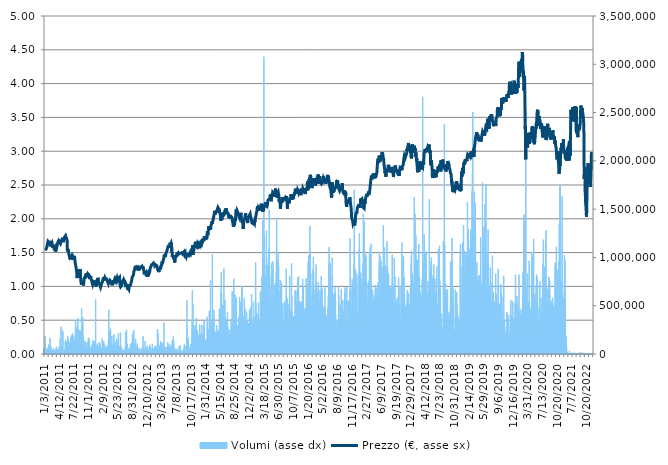
| Category | Volumi (asse dx) |
|---|---|
| 1/3/11 | 57810.176 |
| 1/4/11 | 41521.826 |
| 1/5/11 | 73502.117 |
| 1/6/11 | 15096.544 |
| 1/7/11 | 47100.125 |
| 1/10/11 | 59739.139 |
| 1/11/11 | 182088.08 |
| 1/12/11 | 23761.185 |
| 1/13/11 | 38979.239 |
| 1/14/11 | 40158.894 |
| 1/17/11 | 49718.655 |
| 1/18/11 | 23423.996 |
| 1/19/11 | 47818.044 |
| 1/20/11 | 35039.293 |
| 1/21/11 | 40614.555 |
| 1/24/11 | 27457.1 |
| 1/25/11 | 55677.684 |
| 1/26/11 | 12575.222 |
| 1/27/11 | 15343.614 |
| 1/28/11 | 47602.364 |
| 1/31/11 | 68024.063 |
| 2/1/11 | 47867.66 |
| 2/2/11 | 63451.255 |
| 2/3/11 | 51740.776 |
| 2/4/11 | 97541.761 |
| 2/7/11 | 72814.575 |
| 2/8/11 | 25965.57 |
| 2/9/11 | 42696.418 |
| 2/10/11 | 12645.09 |
| 2/11/11 | 57954.975 |
| 2/14/11 | 165105.101 |
| 2/15/11 | 17365.735 |
| 2/16/11 | 20222.221 |
| 2/17/11 | 29016.472 |
| 2/18/11 | 7947.735 |
| 2/21/11 | 74292.941 |
| 2/22/11 | 47494.018 |
| 2/23/11 | 23543.481 |
| 2/24/11 | 17756.59 |
| 2/25/11 | 28083.886 |
| 2/28/11 | 25432.954 |
| 3/1/11 | 26374.652 |
| 3/2/11 | 41559.291 |
| 3/3/11 | 34167.462 |
| 3/4/11 | 14073.839 |
| 3/7/11 | 21689.448 |
| 3/8/11 | 20088.56 |
| 3/9/11 | 29209.874 |
| 3/10/11 | 59475.869 |
| 3/11/11 | 11088.756 |
| 3/14/11 | 26539.703 |
| 3/15/11 | 34970.438 |
| 3/16/11 | 24125.714 |
| 3/17/11 | 14298.632 |
| 3/18/11 | 8283.911 |
| 3/21/11 | 33834.324 |
| 3/22/11 | 17667.483 |
| 3/23/11 | 5265.412 |
| 3/24/11 | 31788.914 |
| 3/25/11 | 19543.793 |
| 3/28/11 | 59484.982 |
| 3/29/11 | 74784.042 |
| 3/30/11 | 35554.696 |
| 3/31/11 | 32231.411 |
| 4/1/11 | 20441.95 |
| 4/4/11 | 37039.137 |
| 4/5/11 | 8369.98 |
| 4/6/11 | 3499.474 |
| 4/7/11 | 9266.113 |
| 4/8/11 | 46891.534 |
| 4/11/11 | 41811.423 |
| 4/12/11 | 22921.757 |
| 4/13/11 | 7091.093 |
| 4/14/11 | 26754.37 |
| 4/15/11 | 74399.262 |
| 4/18/11 | 33343.223 |
| 4/19/11 | 27151.301 |
| 4/20/11 | 40271.29 |
| 4/21/11 | 14298.632 |
| 4/26/11 | 152664.552 |
| 4/27/11 | 22356.738 |
| 4/28/11 | 50080.146 |
| 4/29/11 | 16146.589 |
| 5/2/11 | 282318.239 |
| 5/3/11 | 65652.602 |
| 5/4/11 | 76438.597 |
| 5/5/11 | 10684.736 |
| 5/6/11 | 47560.848 |
| 5/9/11 | 15454.997 |
| 5/10/11 | 90691.663 |
| 5/11/11 | 11564.668 |
| 5/12/11 | 244919.637 |
| 5/13/11 | 227125.581 |
| 5/16/11 | 25708.375 |
| 5/17/11 | 33398.915 |
| 5/18/11 | 23845.229 |
| 5/19/11 | 30040.189 |
| 5/20/11 | 17675.584 |
| 5/23/11 | 10580.441 |
| 5/24/11 | 44570.702 |
| 5/25/11 | 33851.538 |
| 5/26/11 | 20950.265 |
| 5/27/11 | 28601.314 |
| 5/30/11 | 33465.745 |
| 5/31/11 | 124794.32 |
| 6/1/11 | 146104.051 |
| 6/2/11 | 87123.333 |
| 6/3/11 | 36078.199 |
| 6/6/11 | 120464.531 |
| 6/7/11 | 120870.575 |
| 6/8/11 | 104821.194 |
| 6/9/11 | 83261.356 |
| 6/10/11 | 39356.931 |
| 6/13/11 | 134052.332 |
| 6/14/11 | 88942.938 |
| 6/15/11 | 113842.262 |
| 6/16/11 | 184251.962 |
| 6/17/11 | 151268.205 |
| 6/20/11 | 110017.751 |
| 6/21/11 | 134063.47 |
| 6/22/11 | 118226.731 |
| 6/23/11 | 68666.038 |
| 6/24/11 | 100804.292 |
| 6/27/11 | 121006.261 |
| 6/28/11 | 99007.976 |
| 6/29/11 | 92803.903 |
| 6/30/11 | 121770.758 |
| 7/1/11 | 82192.072 |
| 7/4/11 | 105704.163 |
| 7/5/11 | 81078.235 |
| 7/6/11 | 54056.544 |
| 7/7/11 | 173626.968 |
| 7/8/11 | 122372.23 |
| 7/11/11 | 97535.686 |
| 7/12/11 | 192859.899 |
| 7/13/11 | 145202.855 |
| 7/14/11 | 139645.82 |
| 7/15/11 | 158437.266 |
| 7/18/11 | 72252.594 |
| 7/19/11 | 213791.937 |
| 7/20/11 | 82748.991 |
| 7/21/11 | 175198.491 |
| 7/22/11 | 188015.719 |
| 7/25/11 | 13537.172 |
| 7/26/11 | 173471.031 |
| 7/27/11 | 162735.665 |
| 7/28/11 | 144195.339 |
| 7/29/11 | 106070.717 |
| 8/1/11 | 140707.003 |
| 8/2/11 | 97033.447 |
| 8/3/11 | 75157.684 |
| 8/4/11 | 75309.571 |
| 8/5/11 | 128556.052 |
| 8/8/11 | 232883.107 |
| 8/9/11 | 343612.701 |
| 8/10/11 | 287956.281 |
| 8/11/11 | 175743.259 |
| 8/12/11 | 70774.228 |
| 8/16/11 | 153397.659 |
| 8/17/11 | 146626.542 |
| 8/18/11 | 198374.405 |
| 8/19/11 | 270422.458 |
| 8/22/11 | 57300.848 |
| 8/23/11 | 80459.549 |
| 8/24/11 | 220735.193 |
| 8/25/11 | 372333.499 |
| 8/26/11 | 145840.78 |
| 8/29/11 | 124143.231 |
| 8/30/11 | 205616.372 |
| 8/31/11 | 182563.992 |
| 9/1/11 | 246460.782 |
| 9/2/11 | 78729.051 |
| 9/5/11 | 129746.845 |
| 9/6/11 | 249851.91 |
| 9/7/11 | 139357.235 |
| 9/8/11 | 186928.209 |
| 9/9/11 | 234225.787 |
| 9/12/11 | 211242.263 |
| 9/13/11 | 237912.588 |
| 9/14/11 | 87047.39 |
| 9/15/11 | 239808.136 |
| 9/16/11 | 144456.584 |
| 9/19/11 | 171045.903 |
| 9/20/11 | 469721.348 |
| 9/21/11 | 231239.691 |
| 9/22/11 | 206975.254 |
| 9/23/11 | 165161.805 |
| 9/26/11 | 283697.372 |
| 9/27/11 | 191180.03 |
| 9/28/11 | 379749.63 |
| 9/29/11 | 73630.714 |
| 9/30/11 | 173677.597 |
| 10/3/11 | 163399.917 |
| 10/4/11 | 140981.412 |
| 10/5/11 | 40321.919 |
| 10/6/11 | 59455.617 |
| 10/7/11 | 45138.759 |
| 10/10/11 | 57406.157 |
| 10/11/11 | 52628.808 |
| 10/12/11 | 81136.965 |
| 10/13/11 | 131710.236 |
| 10/14/11 | 90788.87 |
| 10/17/11 | 51648.631 |
| 10/18/11 | 67187.672 |
| 10/19/11 | 19317.987 |
| 10/20/11 | 58248.623 |
| 10/21/11 | 35618.488 |
| 10/24/11 | 57754.484 |
| 10/25/11 | 26599.445 |
| 10/26/11 | 116907.34 |
| 10/27/11 | 46144.25 |
| 10/28/11 | 55582.501 |
| 10/31/11 | 54383.608 |
| 11/1/11 | 124299.169 |
| 11/2/11 | 78134.667 |
| 11/3/11 | 121794.047 |
| 11/4/11 | 166739.404 |
| 11/7/11 | 58598.975 |
| 11/8/11 | 63213.299 |
| 11/9/11 | 161805.105 |
| 11/10/11 | 97568.088 |
| 11/11/11 | 141349.991 |
| 11/14/11 | 55867.036 |
| 11/15/11 | 9383.572 |
| 11/16/11 | 41327.41 |
| 11/17/11 | 26794.873 |
| 11/18/11 | 24238.11 |
| 11/21/11 | 46114.885 |
| 11/22/11 | 33223.739 |
| 11/23/11 | 66263.188 |
| 11/24/11 | 75870.54 |
| 11/25/11 | 55754.64 |
| 11/28/11 | 80532.455 |
| 11/29/11 | 50886.159 |
| 11/30/11 | 40100.164 |
| 12/1/11 | 101053.386 |
| 12/2/11 | 37056.351 |
| 12/5/11 | 97125.591 |
| 12/6/11 | 143183.772 |
| 12/7/11 | 21087.976 |
| 12/8/11 | 84060.281 |
| 12/9/11 | 90785.832 |
| 12/12/11 | 101059.462 |
| 12/13/11 | 74655.445 |
| 12/14/11 | 131726.438 |
| 12/15/11 | 119595.738 |
| 12/16/11 | 73361.368 |
| 12/19/11 | 83709.928 |
| 12/20/11 | 25208.161 |
| 12/21/11 | 77676.981 |
| 12/22/11 | 25248.664 |
| 12/23/11 | 568786.029 |
| 12/27/11 | 23658.915 |
| 12/28/11 | 34993.727 |
| 12/29/11 | 82946.444 |
| 12/30/11 | 42154.688 |
| 1/2/12 | 16270.124 |
| 1/3/12 | 22774.933 |
| 1/4/12 | 27691.005 |
| 1/5/12 | 107496.428 |
| 1/6/12 | 20130.076 |
| 1/9/12 | 41516.763 |
| 1/10/12 | 17711.024 |
| 1/11/12 | 12582.31 |
| 1/12/12 | 78458.692 |
| 1/13/12 | 49304.51 |
| 1/16/12 | 20879.385 |
| 1/17/12 | 18837.012 |
| 1/18/12 | 68737.931 |
| 1/19/12 | 121574.318 |
| 1/20/12 | 62850.795 |
| 1/23/12 | 114857.879 |
| 1/24/12 | 69948.976 |
| 1/25/12 | 95677.603 |
| 1/26/12 | 52611.594 |
| 1/27/12 | 24564.161 |
| 1/30/12 | 63908.941 |
| 1/31/12 | 29260.503 |
| 2/1/12 | 42514.153 |
| 2/2/12 | 32090.662 |
| 2/3/12 | 56366.238 |
| 2/6/12 | 58464.302 |
| 2/7/12 | 58306.34 |
| 2/8/12 | 161450.702 |
| 2/9/12 | 38378.78 |
| 2/10/12 | 71027.373 |
| 2/13/12 | 59169.057 |
| 2/14/12 | 36478.168 |
| 2/15/12 | 69005.252 |
| 2/16/12 | 100674.682 |
| 2/17/12 | 132044.387 |
| 2/20/12 | 111174.116 |
| 2/21/12 | 33132.606 |
| 2/22/12 | 91616.147 |
| 2/23/12 | 84486.577 |
| 2/24/12 | 63055.336 |
| 2/27/12 | 44946.369 |
| 2/28/12 | 11637.574 |
| 2/29/12 | 40154.844 |
| 3/1/12 | 30092.843 |
| 3/2/12 | 36318.181 |
| 3/5/12 | 70004.668 |
| 3/6/12 | 59068.812 |
| 3/7/12 | 32254.7 |
| 3/8/12 | 36944.967 |
| 3/9/12 | 86515.786 |
| 3/12/12 | 47652.993 |
| 3/13/12 | 57993.453 |
| 3/14/12 | 21627.681 |
| 3/15/12 | 63715.538 |
| 3/16/12 | 20907.737 |
| 3/19/12 | 34545.154 |
| 3/20/12 | 73555.783 |
| 3/21/12 | 138539.071 |
| 3/22/12 | 86671.723 |
| 3/23/12 | 455555.364 |
| 3/26/12 | 130332.116 |
| 3/27/12 | 128883.115 |
| 3/28/12 | 198316.688 |
| 3/29/12 | 94307.583 |
| 3/30/12 | 236920.26 |
| 4/2/12 | 210323.853 |
| 4/3/12 | 222305.704 |
| 4/4/12 | 261787.182 |
| 4/5/12 | 52214.663 |
| 4/10/12 | 80032.241 |
| 4/11/12 | 102097.355 |
| 4/12/12 | 74168.394 |
| 4/13/12 | 49037.189 |
| 4/16/12 | 85783.691 |
| 4/17/12 | 186174.85 |
| 4/18/12 | 92412.035 |
| 4/19/12 | 70033.02 |
| 4/20/12 | 45486.073 |
| 4/23/12 | 56310.546 |
| 4/24/12 | 95206.753 |
| 4/25/12 | 35415.973 |
| 4/26/12 | 56386.489 |
| 4/27/12 | 75487.785 |
| 4/30/12 | 58588.849 |
| 5/2/12 | 202105.76 |
| 5/3/12 | 101399.688 |
| 5/4/12 | 129526.103 |
| 5/7/12 | 28195.27 |
| 5/8/12 | 36200.722 |
| 5/9/12 | 47753.238 |
| 5/10/12 | 28596.251 |
| 5/11/12 | 29327.333 |
| 5/14/12 | 36981.42 |
| 5/15/12 | 32857.185 |
| 5/16/12 | 126063.082 |
| 5/17/12 | 79498.611 |
| 5/18/12 | 42377.455 |
| 5/21/12 | 158883.814 |
| 5/22/12 | 111251.072 |
| 5/23/12 | 47411.999 |
| 5/24/12 | 27874.282 |
| 5/25/12 | 43415.349 |
| 5/28/12 | 28715.736 |
| 5/29/12 | 116195.497 |
| 5/30/12 | 63169.758 |
| 5/31/12 | 148244.643 |
| 6/1/12 | 216327.436 |
| 6/4/12 | 43793.041 |
| 6/5/12 | 60948.159 |
| 6/6/12 | 51442.065 |
| 6/7/12 | 84871.357 |
| 6/8/12 | 46767.999 |
| 6/11/12 | 46884.445 |
| 6/12/12 | 36365.772 |
| 6/13/12 | 58158.503 |
| 6/14/12 | 30339.913 |
| 6/15/12 | 219553.513 |
| 6/18/12 | 66625.691 |
| 6/19/12 | 78044.547 |
| 6/20/12 | 34991.702 |
| 6/21/12 | 40014.095 |
| 6/22/12 | 70838.021 |
| 6/25/12 | 36591.577 |
| 6/26/12 | 45690.615 |
| 6/27/12 | 940.686 |
| 6/28/12 | 7319.936 |
| 6/29/12 | 40612.529 |
| 7/2/12 | 34461.11 |
| 7/3/12 | 13481.48 |
| 7/4/12 | 8306.188 |
| 7/5/12 | 22003.348 |
| 7/6/12 | 2957.744 |
| 7/9/12 | 41642.323 |
| 7/10/12 | 19657.201 |
| 7/11/12 | 3351.637 |
| 7/12/12 | 22097.517 |
| 7/13/12 | 53862.129 |
| 7/16/12 | 10270.592 |
| 7/17/12 | 15221.092 |
| 7/18/12 | 14213.575 |
| 7/19/12 | 227581.242 |
| 7/20/12 | 23753.085 |
| 7/23/12 | 65933.087 |
| 7/24/12 | 94220.501 |
| 7/25/12 | 88262.485 |
| 7/26/12 | 251402.169 |
| 7/27/12 | 14785.683 |
| 7/30/12 | 13016.707 |
| 7/31/12 | 32154.455 |
| 8/1/12 | 105543.163 |
| 8/2/12 | 38125.635 |
| 8/3/12 | 17297.892 |
| 8/6/12 | 27943.138 |
| 8/7/12 | 59580.164 |
| 8/8/12 | 30487.749 |
| 8/9/12 | 34843.865 |
| 8/10/12 | 34888.419 |
| 8/13/12 | 13566.537 |
| 8/14/12 | 37852.238 |
| 8/16/12 | 30583.944 |
| 8/17/12 | 54538.532 |
| 8/20/12 | 26316.935 |
| 8/21/12 | 24307.978 |
| 8/22/12 | 98847.989 |
| 8/23/12 | 18783.346 |
| 8/24/12 | 7004.011 |
| 8/27/12 | 61362.304 |
| 8/28/12 | 90060.826 |
| 8/29/12 | 98361.951 |
| 8/30/12 | 112626.155 |
| 8/31/12 | 119537.008 |
| 9/3/12 | 98064.252 |
| 9/4/12 | 20738.636 |
| 9/5/12 | 23991.041 |
| 9/6/12 | 212346.987 |
| 9/7/12 | 189974.048 |
| 9/10/12 | 127172.869 |
| 9/11/12 | 76939.823 |
| 9/12/12 | 132514.224 |
| 9/13/12 | 72000.462 |
| 9/14/12 | 247186.802 |
| 9/17/12 | 81323.279 |
| 9/18/12 | 97563.025 |
| 9/19/12 | 46346.766 |
| 9/20/12 | 25535.224 |
| 9/21/12 | 14697.588 |
| 9/24/12 | 30277.133 |
| 9/25/12 | 118784.662 |
| 9/26/12 | 91535.141 |
| 9/27/12 | 155738.742 |
| 9/28/12 | 89134.316 |
| 10/1/12 | 36821.433 |
| 10/2/12 | 46143.237 |
| 10/3/12 | 33127.543 |
| 10/4/12 | 65748.797 |
| 10/5/12 | 4094.871 |
| 10/8/12 | 32883.512 |
| 10/9/12 | 106503.088 |
| 10/10/12 | 78132.642 |
| 10/11/12 | 42322.776 |
| 10/12/12 | 46509.791 |
| 10/15/12 | 13032.908 |
| 10/16/12 | 16392.646 |
| 10/17/12 | 48057.012 |
| 10/18/12 | 50918.561 |
| 10/19/12 | 30220.428 |
| 10/22/12 | 18765.119 |
| 10/23/12 | 63164.695 |
| 10/24/12 | 56976.823 |
| 10/25/12 | 37323.672 |
| 10/26/12 | 18736.767 |
| 10/29/12 | 19997.428 |
| 10/30/12 | 15683.84 |
| 10/31/12 | 18195.037 |
| 11/1/12 | 13730.575 |
| 11/2/12 | 12728.121 |
| 11/5/12 | 31805.115 |
| 11/6/12 | 6635.432 |
| 11/7/12 | 51402.574 |
| 11/8/12 | 55070.136 |
| 11/9/12 | 25458.268 |
| 11/12/12 | 7173.112 |
| 11/13/12 | 22854.927 |
| 11/14/12 | 68439.22 |
| 11/15/12 | 37294.307 |
| 11/16/12 | 184167.918 |
| 11/19/12 | 18592.981 |
| 11/20/12 | 48540.013 |
| 11/21/12 | 33159.946 |
| 11/22/12 | 19020.289 |
| 11/23/12 | 29411.378 |
| 11/26/12 | 40880.863 |
| 11/27/12 | 34566.419 |
| 11/28/12 | 41690.926 |
| 11/29/12 | 35424.073 |
| 11/30/12 | 133297.961 |
| 12/3/12 | 17651.282 |
| 12/4/12 | 12863.807 |
| 12/5/12 | 25679.01 |
| 12/6/12 | 32850.097 |
| 12/7/12 | 12670.404 |
| 12/10/12 | 19830.352 |
| 12/11/12 | 67739.528 |
| 12/12/12 | 44751.954 |
| 12/13/12 | 37520.112 |
| 12/14/12 | 27964.402 |
| 12/17/12 | 83604.62 |
| 12/18/12 | 61696.455 |
| 12/19/12 | 35646.841 |
| 12/20/12 | 9011.956 |
| 12/21/12 | 27994.779 |
| 12/27/12 | 17000.193 |
| 12/28/12 | 28112.238 |
| 1/2/13 | 23608.286 |
| 1/3/13 | 12156.014 |
| 1/4/13 | 71556.952 |
| 1/7/13 | 46099.697 |
| 1/8/13 | 68899.944 |
| 1/9/13 | 71067.876 |
| 1/10/13 | 92718.846 |
| 1/11/13 | 31856.756 |
| 1/14/13 | 52713.864 |
| 1/15/13 | 26821.2 |
| 1/16/13 | 10219.963 |
| 1/17/13 | 8352.766 |
| 1/18/13 | 17094.363 |
| 1/21/13 | 24353.544 |
| 1/22/13 | 31451.725 |
| 1/23/13 | 30132.334 |
| 1/24/13 | 60129.995 |
| 1/25/13 | 104695.634 |
| 1/28/13 | 31987.379 |
| 1/29/13 | 29835.648 |
| 1/30/13 | 32892.625 |
| 1/31/13 | 56006.772 |
| 2/1/13 | 39111.887 |
| 2/4/13 | 20558.397 |
| 2/5/13 | 13957.393 |
| 2/6/13 | 20720.41 |
| 2/7/13 | 28916.226 |
| 2/8/13 | 20384.233 |
| 2/11/13 | 24193.557 |
| 2/12/13 | 81918.676 |
| 2/13/13 | 70697.272 |
| 2/14/13 | 48682.786 |
| 2/15/13 | 66298.628 |
| 2/18/13 | 82391.55 |
| 2/19/13 | 46663.703 |
| 2/20/13 | 69660.391 |
| 2/21/13 | 29106.591 |
| 2/22/13 | 39700.196 |
| 2/25/13 | 17185.495 |
| 2/26/13 | 37121.156 |
| 2/27/13 | 52347.311 |
| 2/28/13 | 91826.764 |
| 3/1/13 | 255566.908 |
| 3/4/13 | 96491.717 |
| 3/5/13 | 192114.64 |
| 3/6/13 | 210670.155 |
| 3/7/13 | 23247.808 |
| 3/8/13 | 18013.785 |
| 3/11/13 | 11798.574 |
| 3/12/13 | 12930.637 |
| 3/13/13 | 13785.254 |
| 3/14/13 | 24897.299 |
| 3/15/13 | 42247.845 |
| 3/18/13 | 87388.629 |
| 3/19/13 | 65969.54 |
| 3/20/13 | 33396.89 |
| 3/21/13 | 65968.527 |
| 3/22/13 | 108981.882 |
| 3/25/13 | 130042.518 |
| 3/26/13 | 115693.257 |
| 3/27/13 | 34858.041 |
| 3/28/13 | 39260.736 |
| 4/2/13 | 45871.866 |
| 4/3/13 | 99727.92 |
| 4/4/13 | 114518.665 |
| 4/5/13 | 33407.015 |
| 4/8/13 | 41274.756 |
| 4/9/13 | 44135.293 |
| 4/10/13 | 46298.162 |
| 4/11/13 | 32172.681 |
| 4/12/13 | 53695.054 |
| 4/15/13 | 9919.227 |
| 4/16/13 | 3169.373 |
| 4/17/13 | 326397.84 |
| 4/18/13 | 17087.275 |
| 4/19/13 | 50929.7 |
| 4/22/13 | 36226.036 |
| 4/23/13 | 44597.029 |
| 4/24/13 | 14962.884 |
| 4/25/13 | 73282.387 |
| 4/26/13 | 15809.4 |
| 4/29/13 | 10478.17 |
| 4/30/13 | 37821.861 |
| 5/2/13 | 69719.121 |
| 5/3/13 | 4539.393 |
| 5/6/13 | 11436.07 |
| 5/7/13 | 43754.563 |
| 5/8/13 | 34698.054 |
| 5/9/13 | 8126.961 |
| 5/10/13 | 42249.87 |
| 5/13/13 | 69591.536 |
| 5/14/13 | 56484.71 |
| 5/15/13 | 122115.035 |
| 5/16/13 | 78913.34 |
| 5/17/13 | 34697.041 |
| 5/20/13 | 53805.425 |
| 5/21/13 | 37744.905 |
| 5/22/13 | 62877.122 |
| 5/23/13 | 74895.426 |
| 5/24/13 | 57169.213 |
| 5/27/13 | 101040.223 |
| 5/28/13 | 78993.334 |
| 5/29/13 | 17911.515 |
| 5/30/13 | 40012.07 |
| 5/31/13 | 69500.404 |
| 6/3/13 | 82552.55 |
| 6/4/13 | 40012.07 |
| 6/5/13 | 5839.545 |
| 6/6/13 | 44943.331 |
| 6/7/13 | 81633.128 |
| 6/10/13 | 40691.511 |
| 6/11/13 | 30141.447 |
| 6/12/13 | 18636.522 |
| 6/13/13 | 135734.226 |
| 6/14/13 | 97843.51 |
| 6/17/13 | 66478.867 |
| 6/18/13 | 92859.595 |
| 6/19/13 | 24813.255 |
| 6/20/13 | 152911.621 |
| 6/21/13 | 179340.953 |
| 6/24/13 | 52050.625 |
| 6/25/13 | 129244.606 |
| 6/26/13 | 56521.162 |
| 6/27/13 | 49049.34 |
| 6/28/13 | 20672.818 |
| 7/1/13 | 20792.303 |
| 7/2/13 | 15111.733 |
| 7/3/13 | 54269.186 |
| 7/4/13 | 21854.498 |
| 7/5/13 | 19015.226 |
| 7/8/13 | 30088.793 |
| 7/9/13 | 5855.746 |
| 7/10/13 | 5855.746 |
| 7/11/13 | 25902.79 |
| 7/12/13 | 15917.746 |
| 7/15/13 | 37417.842 |
| 7/16/13 | 19930.598 |
| 7/17/13 | 54561.822 |
| 7/18/13 | 38706.855 |
| 7/19/13 | 34903.608 |
| 7/22/13 | 15283.872 |
| 7/23/13 | 26493.124 |
| 7/24/13 | 20711.296 |
| 7/25/13 | 4529.267 |
| 7/26/13 | 4865.443 |
| 7/29/13 | 4865.443 |
| 7/30/13 | 23689.292 |
| 7/31/13 | 83927.633 |
| 8/1/13 | 52927.519 |
| 8/2/13 | 28557.773 |
| 8/5/13 | 37864.389 |
| 8/6/13 | 21925.379 |
| 8/7/13 | 88104.522 |
| 8/8/13 | 34042.915 |
| 8/9/13 | 21642.869 |
| 8/12/13 | 16202.281 |
| 8/13/13 | 30004.749 |
| 8/14/13 | 28677.258 |
| 8/16/13 | 24761.614 |
| 8/19/13 | 9706.585 |
| 8/20/13 | 13568.562 |
| 8/21/13 | 13671.845 |
| 8/22/13 | 24746.425 |
| 8/23/13 | 1916.813 |
| 8/26/13 | 14047.512 |
| 8/27/13 | 20237.409 |
| 8/28/13 | 32068.386 |
| 8/29/13 | 50720.096 |
| 8/30/13 | 39207.069 |
| 9/2/13 | 11216.341 |
| 9/3/13 | 24433.538 |
| 9/4/13 | 8369.98 |
| 9/6/13 | 98808.498 |
| 9/9/13 | 29962.221 |
| 9/10/13 | 49468.548 |
| 9/11/13 | 87077.767 |
| 9/12/13 | 24837.557 |
| 9/13/13 | 20718.384 |
| 9/16/13 | 22021.574 |
| 9/17/13 | 73266.186 |
| 9/18/13 | 21239.863 |
| 9/19/13 | 80728.895 |
| 9/20/13 | 18049.226 |
| 9/23/13 | 29886.277 |
| 9/24/13 | 123188.369 |
| 9/25/13 | 556233.084 |
| 9/26/13 | 258331.249 |
| 9/27/13 | 198440.223 |
| 9/30/13 | 77173.729 |
| 10/1/13 | 18736.767 |
| 10/2/13 | 21532.498 |
| 10/3/13 | 48000.308 |
| 10/4/13 | 161788.904 |
| 10/7/13 | 41674.725 |
| 10/8/13 | 24141.915 |
| 10/9/13 | 66089.024 |
| 10/10/13 | 56613.307 |
| 10/11/13 | 49197.177 |
| 10/14/13 | 47336.056 |
| 10/15/13 | 40469.756 |
| 10/16/13 | 70266.926 |
| 10/17/13 | 59857.611 |
| 10/18/13 | 57379.83 |
| 10/21/13 | 95056.892 |
| 10/22/13 | 95010.313 |
| 10/23/13 | 33078.94 |
| 10/24/13 | 108493.819 |
| 10/25/13 | 62456.902 |
| 10/28/13 | 172282 |
| 10/29/13 | 118730 |
| 10/30/13 | 355929 |
| 10/31/13 | 660242 |
| 11/1/13 | 182930 |
| 11/4/13 | 147508 |
| 11/5/13 | 515184 |
| 11/6/13 | 155033 |
| 11/7/13 | 205618 |
| 11/8/13 | 87253 |
| 11/11/13 | 81127 |
| 11/12/13 | 293929 |
| 11/13/13 | 109362 |
| 11/14/13 | 131128 |
| 11/15/13 | 258490 |
| 11/18/13 | 60639 |
| 11/19/13 | 121122 |
| 11/20/13 | 18398 |
| 11/21/13 | 292013 |
| 11/22/13 | 227954 |
| 11/25/13 | 30002 |
| 11/26/13 | 18817 |
| 11/27/13 | 371686 |
| 11/28/13 | 208540 |
| 11/29/13 | 28039 |
| 12/2/13 | 43349 |
| 12/3/13 | 90168 |
| 12/4/13 | 247769 |
| 12/5/13 | 235844 |
| 12/6/13 | 55570 |
| 12/9/13 | 66388 |
| 12/10/13 | 56080 |
| 12/11/13 | 53449 |
| 12/12/13 | 17458 |
| 12/13/13 | 137747 |
| 12/16/13 | 186070 |
| 12/17/13 | 205598 |
| 12/18/13 | 106411 |
| 12/19/13 | 150755 |
| 12/20/13 | 303405 |
| 12/23/13 | 149468 |
| 12/27/13 | 64605 |
| 12/30/13 | 203718 |
| 1/2/14 | 143813 |
| 1/3/14 | 181278 |
| 1/6/14 | 53127 |
| 1/7/14 | 112172 |
| 1/8/14 | 146000 |
| 1/9/14 | 144802 |
| 1/10/14 | 299932 |
| 1/13/14 | 80159 |
| 1/14/14 | 46130 |
| 1/15/14 | 55139 |
| 1/16/14 | 200453 |
| 1/17/14 | 63411 |
| 1/20/14 | 106769 |
| 1/21/14 | 152896 |
| 1/22/14 | 87702 |
| 1/23/14 | 242672 |
| 1/24/14 | 291576 |
| 1/27/14 | 341744 |
| 1/28/14 | 49290 |
| 1/29/14 | 75409 |
| 1/30/14 | 98187 |
| 1/31/14 | 44833 |
| 2/3/14 | 106421 |
| 2/4/14 | 104136 |
| 2/5/14 | 148834 |
| 2/6/14 | 82960 |
| 2/7/14 | 143314 |
| 2/10/14 | 111315 |
| 2/11/14 | 20637 |
| 2/12/14 | 127386 |
| 2/13/14 | 39737 |
| 2/14/14 | 143131 |
| 2/17/14 | 384354 |
| 2/18/14 | 282611 |
| 2/19/14 | 95627 |
| 2/20/14 | 109663 |
| 2/21/14 | 221309 |
| 2/24/14 | 117745 |
| 2/25/14 | 52042 |
| 2/26/14 | 109193 |
| 2/27/14 | 255109 |
| 2/28/14 | 121743 |
| 3/3/14 | 445541 |
| 3/4/14 | 78211 |
| 3/5/14 | 267858 |
| 3/6/14 | 176545 |
| 3/7/14 | 229162 |
| 3/10/14 | 108201 |
| 3/11/14 | 761188 |
| 3/12/14 | 151088 |
| 3/13/14 | 287019 |
| 3/14/14 | 105889 |
| 3/17/14 | 89445 |
| 3/18/14 | 152571 |
| 3/19/14 | 262570 |
| 3/20/14 | 285797 |
| 3/21/14 | 336331 |
| 3/24/14 | 1034074 |
| 3/25/14 | 348379 |
| 3/26/14 | 386215 |
| 3/27/14 | 244730 |
| 3/28/14 | 361444 |
| 3/31/14 | 211072 |
| 4/1/14 | 363692 |
| 4/2/14 | 130568 |
| 4/3/14 | 455498 |
| 4/4/14 | 212464 |
| 4/7/14 | 150705 |
| 4/8/14 | 248203 |
| 4/9/14 | 89018 |
| 4/10/14 | 179270 |
| 4/11/14 | 62495 |
| 4/14/14 | 154777 |
| 4/15/14 | 224772 |
| 4/16/14 | 72518 |
| 4/17/14 | 196293 |
| 4/22/14 | 105991 |
| 4/23/14 | 198700 |
| 4/24/14 | 297377 |
| 4/25/14 | 139697 |
| 4/28/14 | 96017 |
| 4/29/14 | 239701 |
| 4/30/14 | 181775 |
| 5/2/14 | 211922 |
| 5/5/14 | 129556 |
| 5/6/14 | 63719 |
| 5/7/14 | 157971 |
| 5/8/14 | 107667 |
| 5/9/14 | 242798 |
| 5/12/14 | 141290 |
| 5/13/14 | 153298 |
| 5/14/14 | 468376 |
| 5/15/14 | 188696 |
| 5/16/14 | 406640 |
| 5/19/14 | 444968 |
| 5/20/14 | 376274 |
| 5/21/14 | 209306 |
| 5/22/14 | 87942 |
| 5/23/14 | 89435 |
| 5/26/14 | 632897 |
| 5/27/14 | 847923 |
| 5/28/14 | 362676 |
| 5/29/14 | 629563 |
| 5/30/14 | 175072 |
| 6/2/14 | 169456 |
| 6/3/14 | 259312 |
| 6/4/14 | 508436 |
| 6/5/14 | 146192 |
| 6/6/14 | 354158 |
| 6/9/14 | 64469 |
| 6/10/14 | 247834 |
| 6/11/14 | 218354 |
| 6/12/14 | 157116 |
| 6/13/14 | 883713 |
| 6/16/14 | 280941 |
| 6/17/14 | 180329 |
| 6/18/14 | 210398 |
| 6/19/14 | 182182 |
| 6/20/14 | 561537 |
| 6/23/14 | 59638 |
| 6/24/14 | 371837 |
| 6/25/14 | 255086 |
| 6/26/14 | 156256 |
| 6/27/14 | 108406 |
| 6/30/14 | 101573 |
| 7/1/14 | 266288 |
| 7/2/14 | 252043 |
| 7/3/14 | 335015 |
| 7/4/14 | 122351 |
| 7/7/14 | 35862 |
| 7/8/14 | 434736 |
| 7/9/14 | 176263 |
| 7/10/14 | 284211 |
| 7/11/14 | 244006 |
| 7/14/14 | 114800 |
| 7/15/14 | 93926 |
| 7/16/14 | 157982 |
| 7/17/14 | 207506 |
| 7/18/14 | 150269 |
| 7/21/14 | 155987 |
| 7/22/14 | 107774 |
| 7/23/14 | 143093 |
| 7/24/14 | 250738 |
| 7/25/14 | 144591 |
| 7/28/14 | 46761 |
| 7/29/14 | 198434 |
| 7/30/14 | 60462 |
| 7/31/14 | 158058 |
| 8/1/14 | 362715 |
| 8/4/14 | 287202 |
| 8/5/14 | 221398 |
| 8/6/14 | 293385 |
| 8/7/14 | 272407 |
| 8/8/14 | 647359 |
| 8/11/14 | 143750 |
| 8/12/14 | 152524 |
| 8/13/14 | 117204 |
| 8/14/14 | 182897 |
| 8/18/14 | 221017 |
| 8/19/14 | 214493 |
| 8/20/14 | 371511 |
| 8/21/14 | 778327 |
| 8/22/14 | 422619 |
| 8/25/14 | 328496 |
| 8/26/14 | 320737 |
| 8/27/14 | 410903 |
| 8/28/14 | 365991 |
| 8/29/14 | 612731 |
| 9/1/14 | 182001 |
| 9/2/14 | 249011 |
| 9/3/14 | 458806 |
| 9/4/14 | 294265 |
| 9/5/14 | 581653 |
| 9/8/14 | 581534 |
| 9/9/14 | 206171 |
| 9/10/14 | 145981 |
| 9/11/14 | 187291 |
| 9/12/14 | 104830 |
| 9/15/14 | 108117 |
| 9/16/14 | 293756 |
| 9/17/14 | 85812 |
| 9/18/14 | 226099 |
| 9/19/14 | 144947 |
| 9/22/14 | 56448 |
| 9/23/14 | 383243 |
| 9/24/14 | 134310 |
| 9/25/14 | 316122 |
| 9/26/14 | 150106 |
| 9/29/14 | 121655 |
| 9/30/14 | 589966 |
| 10/1/14 | 547737 |
| 10/2/14 | 376489 |
| 10/3/14 | 120631 |
| 10/6/14 | 253753 |
| 10/7/14 | 464267 |
| 10/8/14 | 530657 |
| 10/9/14 | 516809 |
| 10/10/14 | 504064 |
| 10/13/14 | 469124 |
| 10/14/14 | 454859 |
| 10/15/14 | 674116 |
| 10/16/14 | 699689 |
| 10/17/14 | 416948 |
| 10/20/14 | 302022 |
| 10/21/14 | 350427 |
| 10/22/14 | 301958 |
| 10/23/14 | 217696 |
| 10/24/14 | 392159 |
| 10/27/14 | 194851 |
| 10/28/14 | 199921 |
| 10/29/14 | 123656 |
| 10/30/14 | 321917 |
| 10/31/14 | 577676 |
| 11/3/14 | 273656 |
| 11/4/14 | 346740 |
| 11/5/14 | 473535 |
| 11/6/14 | 167598 |
| 11/7/14 | 211614 |
| 11/10/14 | 332761 |
| 11/11/14 | 181136 |
| 11/12/14 | 229214 |
| 11/13/14 | 177843 |
| 11/14/14 | 441695 |
| 11/17/14 | 432668 |
| 11/18/14 | 239593 |
| 11/19/14 | 337135 |
| 11/20/14 | 135782 |
| 11/21/14 | 122809 |
| 11/24/14 | 267733 |
| 11/25/14 | 306399 |
| 11/26/14 | 223511 |
| 11/27/14 | 208974 |
| 11/28/14 | 174038 |
| 12/1/14 | 154130 |
| 12/2/14 | 317686 |
| 12/3/14 | 314288 |
| 12/4/14 | 267244 |
| 12/5/14 | 456893 |
| 12/8/14 | 134059 |
| 12/9/14 | 333656 |
| 12/10/14 | 300934 |
| 12/11/14 | 117875 |
| 12/12/14 | 247558 |
| 12/15/14 | 482889 |
| 12/16/14 | 449240 |
| 12/17/14 | 388413 |
| 12/18/14 | 225880 |
| 12/19/14 | 616937 |
| 12/22/14 | 196879 |
| 12/23/14 | 355525 |
| 12/29/14 | 108695 |
| 12/30/14 | 113568 |
| 1/2/15 | 87963 |
| 1/5/15 | 225571 |
| 1/6/15 | 281290 |
| 1/7/15 | 201243 |
| 1/8/15 | 537746 |
| 1/9/15 | 312971 |
| 1/12/15 | 189527 |
| 1/13/15 | 201993 |
| 1/14/15 | 384229 |
| 1/15/15 | 350209 |
| 1/16/15 | 213593 |
| 1/19/15 | 107875 |
| 1/20/15 | 385300 |
| 1/21/15 | 378147 |
| 1/22/15 | 557408 |
| 1/23/15 | 946355 |
| 1/26/15 | 522463 |
| 1/27/15 | 341407 |
| 1/28/15 | 430088 |
| 1/29/15 | 258603 |
| 1/30/15 | 285225 |
| 2/2/15 | 299776 |
| 2/3/15 | 355433 |
| 2/4/15 | 386836 |
| 2/5/15 | 383215 |
| 2/6/15 | 410513 |
| 2/9/15 | 205828 |
| 2/10/15 | 372654 |
| 2/11/15 | 401466 |
| 2/12/15 | 532547 |
| 2/13/15 | 279984 |
| 2/16/15 | 157775 |
| 2/17/15 | 138804 |
| 2/18/15 | 149230 |
| 2/19/15 | 263021 |
| 2/20/15 | 113928 |
| 2/23/15 | 364938 |
| 2/24/15 | 309706 |
| 2/25/15 | 646803 |
| 2/26/15 | 251374 |
| 2/27/15 | 131304 |
| 3/2/15 | 287322 |
| 3/3/15 | 488452 |
| 3/4/15 | 386424 |
| 3/5/15 | 523835 |
| 3/6/15 | 798846 |
| 3/9/15 | 488464 |
| 3/10/15 | 607413 |
| 3/11/15 | 499528 |
| 3/12/15 | 1379436 |
| 3/13/15 | 992257 |
| 3/16/15 | 712790 |
| 3/17/15 | 710079 |
| 3/18/15 | 776944 |
| 3/19/15 | 608669 |
| 3/20/15 | 3077585 |
| 3/23/15 | 387347 |
| 3/24/15 | 1231424 |
| 3/25/15 | 579778 |
| 3/26/15 | 929077 |
| 3/27/15 | 801533 |
| 3/30/15 | 742942 |
| 3/31/15 | 570431 |
| 4/1/15 | 732249 |
| 4/2/15 | 810963 |
| 4/7/15 | 774056 |
| 4/8/15 | 778747 |
| 4/9/15 | 1279432 |
| 4/10/15 | 999791 |
| 4/13/15 | 302721 |
| 4/14/15 | 763374 |
| 4/15/15 | 731727 |
| 4/16/15 | 430397 |
| 4/17/15 | 919517 |
| 4/20/15 | 489137 |
| 4/21/15 | 554981 |
| 4/22/15 | 400876 |
| 4/23/15 | 892698 |
| 4/24/15 | 683035 |
| 4/27/15 | 1086393 |
| 4/28/15 | 820835 |
| 4/29/15 | 1491872 |
| 4/30/15 | 908321 |
| 5/4/15 | 444346 |
| 5/5/15 | 697223 |
| 5/6/15 | 336929 |
| 5/7/15 | 535142 |
| 5/8/15 | 370590 |
| 5/11/15 | 252494 |
| 5/12/15 | 396939 |
| 5/13/15 | 317580 |
| 5/14/15 | 814267 |
| 5/15/15 | 943077 |
| 5/18/15 | 419178 |
| 5/19/15 | 411912 |
| 5/20/15 | 772842 |
| 5/21/15 | 498795 |
| 5/22/15 | 865233 |
| 5/25/15 | 359747 |
| 5/26/15 | 957349 |
| 5/27/15 | 455027 |
| 5/28/15 | 362426 |
| 5/29/15 | 562576 |
| 6/1/15 | 602991 |
| 6/2/15 | 487528 |
| 6/3/15 | 503144 |
| 6/4/15 | 351707 |
| 6/5/15 | 637950 |
| 6/8/15 | 683049 |
| 6/9/15 | 730200 |
| 6/10/15 | 318596 |
| 6/11/15 | 376214 |
| 6/12/15 | 535662 |
| 6/15/15 | 642396 |
| 6/16/15 | 584411 |
| 6/17/15 | 855268 |
| 6/18/15 | 1090163 |
| 6/19/15 | 1407203 |
| 6/22/15 | 832211 |
| 6/23/15 | 974541 |
| 6/24/15 | 618857 |
| 6/25/15 | 779566 |
| 6/26/15 | 933282 |
| 6/29/15 | 877769 |
| 6/30/15 | 693627 |
| 7/1/15 | 1042192 |
| 7/2/15 | 912820 |
| 7/3/15 | 457310 |
| 7/6/15 | 431450 |
| 7/7/15 | 468567 |
| 7/8/15 | 515386 |
| 7/9/15 | 333894 |
| 7/10/15 | 497957 |
| 7/13/15 | 658796 |
| 7/14/15 | 766959 |
| 7/15/15 | 526705 |
| 7/16/15 | 358621 |
| 7/17/15 | 412696 |
| 7/20/15 | 316170 |
| 7/21/15 | 741357 |
| 7/22/15 | 411110 |
| 7/23/15 | 720515 |
| 7/24/15 | 263325 |
| 7/27/15 | 257722 |
| 7/28/15 | 113783 |
| 7/29/15 | 236539 |
| 7/30/15 | 169094 |
| 7/31/15 | 522664 |
| 8/3/15 | 197375 |
| 8/4/15 | 179585 |
| 8/5/15 | 347398 |
| 8/6/15 | 186602 |
| 8/7/15 | 226189 |
| 8/10/15 | 179569 |
| 8/11/15 | 228645 |
| 8/12/15 | 543599 |
| 8/13/15 | 344952 |
| 8/14/15 | 240177 |
| 8/17/15 | 408676 |
| 8/18/15 | 483358 |
| 8/19/15 | 261094 |
| 8/20/15 | 206528 |
| 8/21/15 | 527384 |
| 8/24/15 | 881556 |
| 8/25/15 | 593801 |
| 8/26/15 | 386624 |
| 8/27/15 | 494734 |
| 8/28/15 | 268640 |
| 8/31/15 | 179135 |
| 9/1/15 | 574563 |
| 9/2/15 | 207778 |
| 9/3/15 | 338426 |
| 9/4/15 | 520425 |
| 9/7/15 | 164973 |
| 9/8/15 | 281480 |
| 9/9/15 | 176855 |
| 9/10/15 | 353875 |
| 9/11/15 | 97868 |
| 9/14/15 | 282776 |
| 9/15/15 | 234404 |
| 9/16/15 | 807982 |
| 9/17/15 | 457441 |
| 9/18/15 | 339609 |
| 9/21/15 | 246319 |
| 9/22/15 | 441861 |
| 9/23/15 | 175591 |
| 9/24/15 | 264220 |
| 9/25/15 | 349683 |
| 9/28/15 | 237307 |
| 9/29/15 | 937706 |
| 9/30/15 | 601235 |
| 10/1/15 | 430908 |
| 10/2/15 | 206830 |
| 10/5/15 | 251317 |
| 10/6/15 | 184644 |
| 10/7/15 | 274725 |
| 10/8/15 | 272832 |
| 10/9/15 | 173842 |
| 10/12/15 | 388901 |
| 10/13/15 | 361342 |
| 10/14/15 | 187410 |
| 10/15/15 | 298037 |
| 10/16/15 | 394462 |
| 10/19/15 | 131004 |
| 10/20/15 | 118466 |
| 10/21/15 | 384417 |
| 10/22/15 | 657778 |
| 10/23/15 | 363990 |
| 10/26/15 | 350264 |
| 10/27/15 | 624144 |
| 10/28/15 | 653075 |
| 10/29/15 | 334279 |
| 10/30/15 | 197810 |
| 11/2/15 | 357716 |
| 11/3/15 | 480688 |
| 11/4/15 | 341132 |
| 11/5/15 | 424309 |
| 11/6/15 | 538793 |
| 11/9/15 | 430087 |
| 11/10/15 | 794743 |
| 11/11/15 | 370459 |
| 11/12/15 | 618776 |
| 11/13/15 | 427078 |
| 11/16/15 | 800204 |
| 11/17/15 | 458177 |
| 11/18/15 | 301037 |
| 11/19/15 | 422158 |
| 11/20/15 | 454060 |
| 11/23/15 | 304077 |
| 11/24/15 | 546090 |
| 11/25/15 | 298537 |
| 11/26/15 | 292184 |
| 11/27/15 | 319727 |
| 11/30/15 | 347747 |
| 12/1/15 | 522740 |
| 12/2/15 | 378218 |
| 12/3/15 | 539543 |
| 12/4/15 | 179355 |
| 12/7/15 | 276571 |
| 12/8/15 | 292569 |
| 12/9/15 | 455262 |
| 12/10/15 | 360007 |
| 12/11/15 | 358454 |
| 12/14/15 | 776469 |
| 12/15/15 | 527284 |
| 12/16/15 | 336292 |
| 12/17/15 | 700536 |
| 12/18/15 | 523355 |
| 12/21/15 | 226223 |
| 12/22/15 | 137146 |
| 12/23/15 | 466210 |
| 12/28/15 | 191453 |
| 12/29/15 | 384384 |
| 12/30/15 | 350976 |
| 1/4/16 | 451345 |
| 1/5/16 | 440396 |
| 1/6/16 | 218382 |
| 1/7/16 | 474740 |
| 1/8/16 | 266150 |
| 1/11/16 | 427444 |
| 1/12/16 | 783060 |
| 1/13/16 | 417669 |
| 1/14/16 | 297530 |
| 1/15/16 | 543483 |
| 1/18/16 | 424328 |
| 1/19/16 | 687480 |
| 1/20/16 | 479185 |
| 1/21/16 | 725312 |
| 1/22/16 | 371793 |
| 1/25/16 | 947124 |
| 1/26/16 | 411176 |
| 1/27/16 | 600868 |
| 1/28/16 | 1021405 |
| 1/29/16 | 582871 |
| 2/1/16 | 572689 |
| 2/2/16 | 558812 |
| 2/3/16 | 834500 |
| 2/4/16 | 451198 |
| 2/5/16 | 1324118 |
| 2/8/16 | 924381 |
| 2/9/16 | 1064948 |
| 2/10/16 | 835854 |
| 2/11/16 | 835554 |
| 2/12/16 | 593898 |
| 2/15/16 | 371988 |
| 2/16/16 | 217925 |
| 2/17/16 | 490954 |
| 2/18/16 | 448620 |
| 2/19/16 | 274305 |
| 2/22/16 | 385743 |
| 2/23/16 | 683710 |
| 2/24/16 | 315736 |
| 2/25/16 | 311262 |
| 2/26/16 | 874830 |
| 2/29/16 | 254135 |
| 3/1/16 | 1002896 |
| 3/2/16 | 843628 |
| 3/3/16 | 667068 |
| 3/4/16 | 604244 |
| 3/7/16 | 274656 |
| 3/8/16 | 407796 |
| 3/9/16 | 284192 |
| 3/10/16 | 504411 |
| 3/11/16 | 323293 |
| 3/14/16 | 652773 |
| 3/15/16 | 644315 |
| 3/16/16 | 483204 |
| 3/17/16 | 726462 |
| 3/18/16 | 925935 |
| 3/21/16 | 546927 |
| 3/22/16 | 752003 |
| 3/23/16 | 690347 |
| 3/24/16 | 580125 |
| 3/29/16 | 524284 |
| 3/30/16 | 556987 |
| 3/31/16 | 342251 |
| 4/1/16 | 633213 |
| 4/4/16 | 455549 |
| 4/5/16 | 326873 |
| 4/6/16 | 742370 |
| 4/7/16 | 338969 |
| 4/8/16 | 303230 |
| 4/11/16 | 529940 |
| 4/12/16 | 543235 |
| 4/13/16 | 348944 |
| 4/14/16 | 302701 |
| 4/15/16 | 240899 |
| 4/18/16 | 662872 |
| 4/19/16 | 336486 |
| 4/20/16 | 349648 |
| 4/21/16 | 307776 |
| 4/22/16 | 593772 |
| 4/25/16 | 311080 |
| 4/26/16 | 807773 |
| 4/27/16 | 384853 |
| 4/28/16 | 652900 |
| 4/29/16 | 397182 |
| 5/2/16 | 140568 |
| 5/3/16 | 678863 |
| 5/4/16 | 354930 |
| 5/5/16 | 221331 |
| 5/6/16 | 154423 |
| 5/9/16 | 133928 |
| 5/10/16 | 130837 |
| 5/11/16 | 297069 |
| 5/12/16 | 488489 |
| 5/13/16 | 207503 |
| 5/16/16 | 160141 |
| 5/17/16 | 362559 |
| 5/18/16 | 486121 |
| 5/19/16 | 402415 |
| 5/20/16 | 704502 |
| 5/23/16 | 369817 |
| 5/24/16 | 406943 |
| 5/25/16 | 179635 |
| 5/26/16 | 391630 |
| 5/27/16 | 201191 |
| 5/30/16 | 292083 |
| 5/31/16 | 355227 |
| 6/1/16 | 400355 |
| 6/2/16 | 222596 |
| 6/3/16 | 283350 |
| 6/6/16 | 161867 |
| 6/7/16 | 233416 |
| 6/8/16 | 330738 |
| 6/9/16 | 334131 |
| 6/10/16 | 481013 |
| 6/13/16 | 600303 |
| 6/14/16 | 285632 |
| 6/15/16 | 707798 |
| 6/16/16 | 932178 |
| 6/17/16 | 1104711 |
| 6/20/16 | 698519 |
| 6/21/16 | 674331 |
| 6/22/16 | 510205 |
| 6/23/16 | 447747 |
| 6/24/16 | 325999 |
| 6/27/16 | 944408 |
| 6/28/16 | 595889 |
| 6/29/16 | 495589 |
| 6/30/16 | 516937 |
| 7/1/16 | 693185 |
| 7/4/16 | 267728 |
| 7/5/16 | 267804 |
| 7/6/16 | 362493 |
| 7/7/16 | 233588 |
| 7/8/16 | 995134 |
| 7/11/16 | 803268 |
| 7/12/16 | 594089 |
| 7/13/16 | 501936 |
| 7/14/16 | 375705 |
| 7/15/16 | 446866 |
| 7/18/16 | 475713 |
| 7/19/16 | 300562 |
| 7/20/16 | 584623 |
| 7/21/16 | 623170 |
| 7/22/16 | 449444 |
| 7/25/16 | 358823 |
| 7/26/16 | 445964 |
| 7/27/16 | 691137 |
| 7/28/16 | 637313 |
| 7/29/16 | 622416 |
| 8/1/16 | 549580 |
| 8/2/16 | 408209 |
| 8/3/16 | 289919 |
| 8/4/16 | 184077 |
| 8/5/16 | 242425 |
| 8/8/16 | 253159 |
| 8/9/16 | 183075 |
| 8/10/16 | 320410 |
| 8/11/16 | 289755 |
| 8/12/16 | 347032 |
| 8/16/16 | 324842 |
| 8/17/16 | 333167 |
| 8/18/16 | 323858 |
| 8/19/16 | 210842 |
| 8/22/16 | 322165 |
| 8/23/16 | 702318 |
| 8/24/16 | 606021 |
| 8/25/16 | 227315 |
| 8/26/16 | 352320 |
| 8/29/16 | 283882 |
| 8/30/16 | 308076 |
| 8/31/16 | 230132 |
| 9/1/16 | 510979 |
| 9/2/16 | 342131 |
| 9/5/16 | 150017 |
| 9/6/16 | 129646 |
| 9/7/16 | 260735 |
| 9/8/16 | 293755 |
| 9/9/16 | 669998 |
| 9/12/16 | 325686 |
| 9/13/16 | 253959 |
| 9/14/16 | 473204 |
| 9/15/16 | 345304 |
| 9/16/16 | 308281 |
| 9/19/16 | 193543 |
| 9/20/16 | 558562 |
| 9/21/16 | 179320 |
| 9/22/16 | 83757 |
| 9/23/16 | 354260 |
| 9/26/16 | 425060 |
| 9/27/16 | 444045 |
| 9/28/16 | 342449 |
| 9/29/16 | 179346 |
| 9/30/16 | 552032 |
| 10/3/16 | 186559 |
| 10/4/16 | 635497 |
| 10/5/16 | 687672 |
| 10/6/16 | 208404 |
| 10/7/16 | 343238 |
| 10/10/16 | 273097 |
| 10/11/16 | 365736 |
| 10/12/16 | 358787 |
| 10/13/16 | 217047 |
| 10/14/16 | 360394 |
| 10/17/16 | 555938 |
| 10/18/16 | 694850 |
| 10/19/16 | 294223 |
| 10/20/16 | 140508 |
| 10/21/16 | 320035 |
| 10/24/16 | 154062 |
| 10/25/16 | 143894 |
| 10/26/16 | 321642 |
| 10/27/16 | 550737 |
| 10/28/16 | 199474 |
| 10/31/16 | 125025 |
| 11/1/16 | 206726 |
| 11/2/16 | 396955 |
| 11/3/16 | 491552 |
| 11/4/16 | 326982 |
| 11/7/16 | 444833 |
| 11/8/16 | 651389 |
| 11/9/16 | 1196443 |
| 11/10/16 | 525123 |
| 11/11/16 | 376050 |
| 11/14/16 | 664816 |
| 11/15/16 | 477629 |
| 11/16/16 | 473043 |
| 11/17/16 | 365315 |
| 11/18/16 | 390527 |
| 11/21/16 | 292755 |
| 11/22/16 | 449131 |
| 11/23/16 | 774864 |
| 11/24/16 | 683555 |
| 11/25/16 | 483891 |
| 11/28/16 | 466494 |
| 11/29/16 | 437385 |
| 11/30/16 | 646834 |
| 12/1/16 | 714826 |
| 12/2/16 | 521686 |
| 12/5/16 | 608363 |
| 12/6/16 | 934060 |
| 12/7/16 | 1702104 |
| 12/8/16 | 1077540 |
| 12/9/16 | 530543 |
| 12/12/16 | 749401 |
| 12/13/16 | 764025 |
| 12/14/16 | 386248 |
| 12/15/16 | 876899 |
| 12/16/16 | 861733 |
| 12/19/16 | 827939 |
| 12/20/16 | 608541 |
| 12/21/16 | 796737 |
| 12/22/16 | 687247 |
| 12/23/16 | 195660 |
| 12/27/16 | 84094 |
| 12/28/16 | 395962 |
| 12/29/16 | 313112 |
| 12/30/16 | 311857 |
| 1/2/17 | 127966 |
| 1/3/17 | 298086 |
| 1/4/17 | 822467 |
| 1/5/17 | 586408 |
| 1/6/17 | 105325 |
| 1/9/17 | 301252 |
| 1/10/17 | 576192 |
| 1/11/17 | 1076068 |
| 1/12/17 | 1248707 |
| 1/13/17 | 991788 |
| 1/16/17 | 492382 |
| 1/17/17 | 385369 |
| 1/18/17 | 420667 |
| 1/19/17 | 562873 |
| 1/20/17 | 651587 |
| 1/23/17 | 842240 |
| 1/24/17 | 773777 |
| 1/25/17 | 490343 |
| 1/26/17 | 470833 |
| 1/27/17 | 432732 |
| 1/30/17 | 498532 |
| 1/31/17 | 503661 |
| 2/1/17 | 754069 |
| 2/2/17 | 539273 |
| 2/3/17 | 483165 |
| 2/6/17 | 279207 |
| 2/7/17 | 942033 |
| 2/8/17 | 1450197 |
| 2/9/17 | 925671 |
| 2/10/17 | 844744 |
| 2/13/17 | 264950 |
| 2/14/17 | 686877 |
| 2/15/17 | 1371782 |
| 2/16/17 | 899651 |
| 2/17/17 | 248763 |
| 2/20/17 | 561451 |
| 2/21/17 | 915700 |
| 2/22/17 | 1005429 |
| 2/23/17 | 980998 |
| 2/24/17 | 770115 |
| 2/27/17 | 1030126 |
| 2/28/17 | 813636 |
| 3/1/17 | 559256 |
| 3/2/17 | 319042 |
| 3/3/17 | 301817 |
| 3/6/17 | 334225 |
| 3/7/17 | 519357 |
| 3/8/17 | 226950 |
| 3/9/17 | 528598 |
| 3/10/17 | 415691 |
| 3/13/17 | 733120 |
| 3/14/17 | 576478 |
| 3/15/17 | 593471 |
| 3/16/17 | 644631 |
| 3/17/17 | 666735 |
| 3/20/17 | 762688 |
| 3/21/17 | 620810 |
| 3/22/17 | 1033883 |
| 3/23/17 | 437912 |
| 3/24/17 | 851887 |
| 3/27/17 | 1104031 |
| 3/28/17 | 684195 |
| 3/29/17 | 953031 |
| 3/30/17 | 739040 |
| 3/31/17 | 1139938 |
| 4/3/17 | 568545 |
| 4/4/17 | 471603 |
| 4/5/17 | 499704 |
| 4/6/17 | 671266 |
| 4/7/17 | 576156 |
| 4/10/17 | 445327 |
| 4/11/17 | 477484 |
| 4/12/17 | 659335 |
| 4/13/17 | 285022 |
| 4/18/17 | 557341 |
| 4/19/17 | 355211 |
| 4/20/17 | 454869 |
| 4/21/17 | 221953 |
| 4/24/17 | 181658 |
| 4/25/17 | 572081 |
| 4/26/17 | 606645 |
| 4/27/17 | 395991 |
| 4/28/17 | 428008 |
| 5/2/17 | 515297 |
| 5/3/17 | 305077 |
| 5/4/17 | 709868 |
| 5/5/17 | 364046 |
| 5/8/17 | 313353 |
| 5/9/17 | 616386 |
| 5/10/17 | 521793 |
| 5/11/17 | 682986 |
| 5/12/17 | 329958 |
| 5/15/17 | 531166 |
| 5/16/17 | 420989 |
| 5/17/17 | 379961 |
| 5/18/17 | 536019 |
| 5/19/17 | 610270 |
| 5/22/17 | 388549 |
| 5/23/17 | 736843 |
| 5/24/17 | 611859 |
| 5/25/17 | 603420 |
| 5/26/17 | 559341 |
| 5/29/17 | 345091 |
| 5/30/17 | 391960 |
| 5/31/17 | 935784 |
| 6/1/17 | 1058567 |
| 6/2/17 | 373390 |
| 6/5/17 | 426554 |
| 6/6/17 | 1012087 |
| 6/7/17 | 377423 |
| 6/8/17 | 616631 |
| 6/9/17 | 738185 |
| 6/12/17 | 908155 |
| 6/13/17 | 960850 |
| 6/14/17 | 623701 |
| 6/15/17 | 775725 |
| 6/16/17 | 771102 |
| 6/19/17 | 261740 |
| 6/20/17 | 565506 |
| 6/21/17 | 445626 |
| 6/22/17 | 364715 |
| 6/23/17 | 818366 |
| 6/26/17 | 898278 |
| 6/27/17 | 785507 |
| 6/28/17 | 1331028 |
| 6/29/17 | 908394 |
| 6/30/17 | 413960 |
| 7/3/17 | 610632 |
| 7/4/17 | 557317 |
| 7/5/17 | 706280 |
| 7/6/17 | 1103509 |
| 7/7/17 | 694746 |
| 7/10/17 | 326541 |
| 7/11/17 | 459359 |
| 7/12/17 | 763403 |
| 7/13/17 | 305842 |
| 7/14/17 | 915143 |
| 7/17/17 | 188663 |
| 7/18/17 | 581983 |
| 7/19/17 | 484256 |
| 7/20/17 | 329204 |
| 7/21/17 | 711548 |
| 7/24/17 | 1165400 |
| 7/25/17 | 836318 |
| 7/26/17 | 810716 |
| 7/27/17 | 891569 |
| 7/28/17 | 652817 |
| 7/31/17 | 615744 |
| 8/1/17 | 801098 |
| 8/2/17 | 553026 |
| 8/3/17 | 833834 |
| 8/4/17 | 674538 |
| 8/7/17 | 272773 |
| 8/8/17 | 512238 |
| 8/9/17 | 569825 |
| 8/10/17 | 419380 |
| 8/11/17 | 697865 |
| 8/14/17 | 664873 |
| 8/16/17 | 618314 |
| 8/17/17 | 415333 |
| 8/18/17 | 558430 |
| 8/21/17 | 327914 |
| 8/22/17 | 678163 |
| 8/23/17 | 489728 |
| 8/24/17 | 670371 |
| 8/25/17 | 389770 |
| 8/28/17 | 605871 |
| 8/29/17 | 1026380 |
| 8/30/17 | 792592 |
| 8/31/17 | 677733 |
| 9/1/17 | 376646 |
| 9/4/17 | 97472 |
| 9/5/17 | 219771 |
| 9/6/17 | 320787 |
| 9/7/17 | 425747 |
| 9/8/17 | 471380 |
| 9/11/17 | 706179 |
| 9/12/17 | 993872 |
| 9/13/17 | 638058 |
| 9/14/17 | 800595 |
| 9/15/17 | 806514 |
| 9/18/17 | 555217 |
| 9/19/17 | 364584 |
| 9/20/17 | 368231 |
| 9/21/17 | 359731 |
| 9/22/17 | 549228 |
| 9/25/17 | 318597 |
| 9/26/17 | 426159 |
| 9/27/17 | 398014 |
| 9/28/17 | 501969 |
| 9/29/17 | 353100 |
| 10/2/17 | 579415 |
| 10/3/17 | 184062 |
| 10/4/17 | 552459 |
| 10/5/17 | 446561 |
| 10/6/17 | 437415 |
| 10/9/17 | 514513 |
| 10/10/17 | 598546 |
| 10/11/17 | 791085 |
| 10/12/17 | 469554 |
| 10/13/17 | 262091 |
| 10/16/17 | 396251 |
| 10/17/17 | 502875 |
| 10/18/17 | 256252 |
| 10/19/17 | 400529 |
| 10/20/17 | 701588 |
| 10/23/17 | 206557 |
| 10/24/17 | 240784 |
| 10/25/17 | 304553 |
| 10/26/17 | 378344 |
| 10/27/17 | 378615 |
| 10/30/17 | 159388 |
| 10/31/17 | 407884 |
| 11/1/17 | 433454 |
| 11/2/17 | 1154368 |
| 11/3/17 | 537208 |
| 11/6/17 | 720991 |
| 11/7/17 | 640432 |
| 11/8/17 | 870765 |
| 11/9/17 | 937949 |
| 11/10/17 | 989473 |
| 11/13/17 | 459135 |
| 11/14/17 | 1011695 |
| 11/15/17 | 281844 |
| 11/16/17 | 581958 |
| 11/17/17 | 789503 |
| 11/20/17 | 477977 |
| 11/21/17 | 611662 |
| 11/22/17 | 476290 |
| 11/23/17 | 233227 |
| 11/24/17 | 466513 |
| 11/27/17 | 383240 |
| 11/28/17 | 260663 |
| 11/29/17 | 496640 |
| 11/30/17 | 289369 |
| 12/1/17 | 491277 |
| 12/4/17 | 338880 |
| 12/5/17 | 283023 |
| 12/6/17 | 525820 |
| 12/7/17 | 307975 |
| 12/8/17 | 661472 |
| 12/11/17 | 289326 |
| 12/12/17 | 358708 |
| 12/13/17 | 470189 |
| 12/14/17 | 366835 |
| 12/15/17 | 486795 |
| 12/18/17 | 631144 |
| 12/19/17 | 445305 |
| 12/20/17 | 278611 |
| 12/21/17 | 518832 |
| 12/22/17 | 239725 |
| 12/27/17 | 439445 |
| 12/28/17 | 254273 |
| 12/29/17 | 294461 |
| 1/2/18 | 161042 |
| 1/3/18 | 691910 |
| 1/4/18 | 253534 |
| 1/5/18 | 429606 |
| 1/8/18 | 560334 |
| 1/9/18 | 919716 |
| 1/10/18 | 1009953 |
| 1/11/18 | 1068867 |
| 1/12/18 | 576454 |
| 1/15/18 | 477340 |
| 1/16/18 | 830890 |
| 1/17/18 | 648091 |
| 1/18/18 | 570382 |
| 1/19/18 | 760105 |
| 1/22/18 | 463197 |
| 1/23/18 | 687332 |
| 1/24/18 | 661894 |
| 1/25/18 | 441725 |
| 1/26/18 | 714889 |
| 1/29/18 | 589934 |
| 1/30/18 | 1621250 |
| 1/31/18 | 811136 |
| 2/1/18 | 524890 |
| 2/2/18 | 718520 |
| 2/5/18 | 1449725 |
| 2/6/18 | 1156030 |
| 2/7/18 | 980992 |
| 2/8/18 | 661532 |
| 2/9/18 | 1229388 |
| 2/12/18 | 666105 |
| 2/13/18 | 984069 |
| 2/14/18 | 722511 |
| 2/15/18 | 370359 |
| 2/16/18 | 291279 |
| 2/19/18 | 377469 |
| 2/20/18 | 430844 |
| 2/21/18 | 660837 |
| 2/22/18 | 974617 |
| 2/23/18 | 893797 |
| 2/26/18 | 541235 |
| 2/27/18 | 783402 |
| 2/28/18 | 541175 |
| 3/1/18 | 1138223 |
| 3/2/18 | 414570 |
| 3/5/18 | 592831 |
| 3/6/18 | 800219 |
| 3/7/18 | 568544 |
| 3/8/18 | 657256 |
| 3/9/18 | 633367 |
| 3/12/18 | 337039 |
| 3/13/18 | 550245 |
| 3/14/18 | 623747 |
| 3/15/18 | 265828 |
| 3/16/18 | 114673 |
| 3/19/18 | 518259 |
| 3/20/18 | 529377 |
| 3/21/18 | 294801 |
| 3/22/18 | 560734 |
| 3/23/18 | 775807 |
| 3/26/18 | 560055 |
| 3/27/18 | 506075 |
| 3/28/18 | 2664421 |
| 3/29/18 | 684087 |
| 4/3/18 | 475759 |
| 4/4/18 | 783897 |
| 4/5/18 | 780695 |
| 4/6/18 | 956907 |
| 4/9/18 | 565409 |
| 4/10/18 | 1239967 |
| 4/11/18 | 1029800 |
| 4/12/18 | 515136 |
| 4/13/18 | 509490 |
| 4/16/18 | 715464 |
| 4/17/18 | 1043084 |
| 4/18/18 | 476230 |
| 4/19/18 | 942989 |
| 4/20/18 | 528387 |
| 4/23/18 | 397931 |
| 4/24/18 | 1060313 |
| 4/25/18 | 210332 |
| 4/26/18 | 382195 |
| 4/27/18 | 367910 |
| 4/30/18 | 382799 |
| 5/2/18 | 611283 |
| 5/3/18 | 497576 |
| 5/4/18 | 268015 |
| 5/7/18 | 358667 |
| 5/8/18 | 752645 |
| 5/9/18 | 426613 |
| 5/10/18 | 634356 |
| 5/11/18 | 277601 |
| 5/14/18 | 511598 |
| 5/15/18 | 359056 |
| 5/16/18 | 1601123 |
| 5/17/18 | 694064 |
| 5/18/18 | 766109 |
| 5/21/18 | 360795 |
| 5/22/18 | 904712 |
| 5/23/18 | 445480 |
| 5/24/18 | 490545 |
| 5/25/18 | 638121 |
| 5/28/18 | 297854 |
| 5/29/18 | 960020 |
| 5/30/18 | 996952 |
| 5/31/18 | 550612 |
| 6/1/18 | 819246 |
| 6/4/18 | 505595 |
| 6/5/18 | 784099 |
| 6/6/18 | 547863 |
| 6/7/18 | 700721 |
| 6/8/18 | 462014 |
| 6/11/18 | 648237 |
| 6/12/18 | 459629 |
| 6/13/18 | 603257 |
| 6/14/18 | 798133 |
| 6/15/18 | 926035 |
| 6/18/18 | 307351 |
| 6/19/18 | 624642 |
| 6/20/18 | 482458 |
| 6/21/18 | 256211 |
| 6/22/18 | 775794 |
| 6/25/18 | 418642 |
| 6/26/18 | 260147 |
| 6/27/18 | 638501 |
| 6/28/18 | 636953 |
| 6/29/18 | 570664 |
| 7/2/18 | 223292 |
| 7/3/18 | 410992 |
| 7/4/18 | 128120 |
| 7/5/18 | 904463 |
| 7/6/18 | 309873 |
| 7/9/18 | 519622 |
| 7/10/18 | 520198 |
| 7/11/18 | 370009 |
| 7/12/18 | 194366 |
| 7/13/18 | 178123 |
| 7/16/18 | 415731 |
| 7/17/18 | 1083377 |
| 7/18/18 | 417973 |
| 7/19/18 | 367788 |
| 7/20/18 | 363148 |
| 7/23/18 | 359055 |
| 7/24/18 | 1118729 |
| 7/25/18 | 403590 |
| 7/26/18 | 760887 |
| 7/27/18 | 464694 |
| 7/30/18 | 680569 |
| 7/31/18 | 544702 |
| 8/1/18 | 390822 |
| 8/2/18 | 318170 |
| 8/3/18 | 367935 |
| 8/6/18 | 303958 |
| 8/7/18 | 415612 |
| 8/8/18 | 200131 |
| 8/9/18 | 265938 |
| 8/10/18 | 225475 |
| 8/13/18 | 127533 |
| 8/14/18 | 164747 |
| 8/16/18 | 269797 |
| 8/17/18 | 109020 |
| 8/20/18 | 125372 |
| 8/21/18 | 1167108 |
| 8/22/18 | 395217 |
| 8/23/18 | 602080 |
| 8/24/18 | 315853 |
| 8/27/18 | 111592 |
| 8/28/18 | 2380775 |
| 8/29/18 | 596894 |
| 8/30/18 | 1129649 |
| 8/31/18 | 496645 |
| 9/3/18 | 613223 |
| 9/4/18 | 728705 |
| 9/5/18 | 126288 |
| 9/6/18 | 193112 |
| 9/7/18 | 607865 |
| 9/10/18 | 299979 |
| 9/11/18 | 661387 |
| 9/12/18 | 335612 |
| 9/13/18 | 172452 |
| 9/14/18 | 224453 |
| 9/17/18 | 567107 |
| 9/18/18 | 669039 |
| 9/19/18 | 124636 |
| 9/20/18 | 176107 |
| 9/21/18 | 199943 |
| 9/24/18 | 140366 |
| 9/25/18 | 184680 |
| 9/26/18 | 263875 |
| 9/27/18 | 429504 |
| 9/28/18 | 232930 |
| 10/1/18 | 250034 |
| 10/2/18 | 390344 |
| 10/3/18 | 211498 |
| 10/4/18 | 260542 |
| 10/5/18 | 284606 |
| 10/8/18 | 478275 |
| 10/9/18 | 959333 |
| 10/10/18 | 354572 |
| 10/11/18 | 936019 |
| 10/12/18 | 337155 |
| 10/15/18 | 584957 |
| 10/16/18 | 570631 |
| 10/17/18 | 709686 |
| 10/18/18 | 1201229 |
| 10/19/18 | 971584 |
| 10/22/18 | 172634 |
| 10/23/18 | 561360 |
| 10/24/18 | 551023 |
| 10/25/18 | 684574 |
| 10/26/18 | 155172 |
| 10/29/18 | 521845 |
| 10/30/18 | 380484 |
| 10/31/18 | 250186 |
| 11/1/18 | 85526 |
| 11/2/18 | 205989 |
| 11/5/18 | 185311 |
| 11/6/18 | 247285 |
| 11/7/18 | 192323 |
| 11/8/18 | 251838 |
| 11/9/18 | 666238 |
| 11/12/18 | 176187 |
| 11/13/18 | 410225 |
| 11/14/18 | 306799 |
| 11/15/18 | 299400 |
| 11/16/18 | 165059 |
| 11/19/18 | 393850 |
| 11/20/18 | 641808 |
| 11/21/18 | 507555 |
| 11/22/18 | 128128 |
| 11/23/18 | 191219 |
| 11/26/18 | 416958 |
| 11/27/18 | 231163 |
| 11/28/18 | 191467 |
| 11/29/18 | 386198 |
| 11/30/18 | 143027 |
| 12/3/18 | 143500 |
| 12/4/18 | 303759 |
| 12/5/18 | 125272 |
| 12/6/18 | 300632 |
| 12/7/18 | 177028 |
| 12/10/18 | 245095 |
| 12/11/18 | 359408 |
| 12/12/18 | 271335 |
| 12/13/18 | 1067475 |
| 12/14/18 | 1132715 |
| 12/17/18 | 517721 |
| 12/18/18 | 585580 |
| 12/19/18 | 332596 |
| 12/20/18 | 105683 |
| 12/21/18 | 216375 |
| 12/27/18 | 328038 |
| 12/28/18 | 219473 |
| 1/2/19 | 905398 |
| 1/3/19 | 565809 |
| 1/4/19 | 1153416 |
| 1/7/19 | 1135860 |
| 1/8/19 | 727940 |
| 1/9/19 | 750405 |
| 1/10/19 | 987835 |
| 1/11/19 | 1331928 |
| 1/14/19 | 833105 |
| 1/15/19 | 802735 |
| 1/16/19 | 1069132 |
| 1/17/19 | 623829 |
| 1/18/19 | 647709 |
| 1/21/19 | 562661 |
| 1/22/19 | 429141 |
| 1/23/19 | 487373 |
| 1/24/19 | 353936 |
| 1/25/19 | 319651 |
| 1/28/19 | 1038999 |
| 1/29/19 | 544370 |
| 1/30/19 | 613429 |
| 1/31/19 | 994983 |
| 2/1/19 | 964613 |
| 2/4/19 | 1021429 |
| 2/5/19 | 728403 |
| 2/6/19 | 530596 |
| 2/7/19 | 1569839 |
| 2/8/19 | 842987 |
| 2/11/19 | 1252560 |
| 2/12/19 | 755695 |
| 2/13/19 | 1293293 |
| 2/14/19 | 858767 |
| 2/15/19 | 1019355 |
| 2/18/19 | 809351 |
| 2/19/19 | 699377 |
| 2/20/19 | 1087190 |
| 2/21/19 | 892706 |
| 2/22/19 | 856012 |
| 2/25/19 | 873423 |
| 2/26/19 | 953227 |
| 2/27/19 | 930934 |
| 2/28/19 | 1196437 |
| 3/1/19 | 1287811 |
| 3/4/19 | 437998 |
| 3/5/19 | 834040 |
| 3/6/19 | 487962 |
| 3/7/19 | 1139819 |
| 3/8/19 | 1153942 |
| 3/11/19 | 1685584 |
| 3/12/19 | 890505 |
| 3/13/19 | 1880728 |
| 3/14/19 | 1036268 |
| 3/15/19 | 2505719 |
| 3/18/19 | 1036686 |
| 3/19/19 | 617739 |
| 3/20/19 | 1218129 |
| 3/21/19 | 579697 |
| 3/22/19 | 565465 |
| 3/25/19 | 1428515 |
| 3/26/19 | 967410 |
| 3/27/19 | 1680977 |
| 3/28/19 | 1422675 |
| 3/29/19 | 1541264 |
| 4/1/19 | 1565266 |
| 4/2/19 | 1215913 |
| 4/3/19 | 1229359 |
| 4/4/19 | 837813 |
| 4/5/19 | 810115 |
| 4/8/19 | 639692 |
| 4/9/19 | 727082 |
| 4/10/19 | 635474 |
| 4/11/19 | 499724 |
| 4/12/19 | 947905 |
| 4/15/19 | 481782 |
| 4/16/19 | 758497 |
| 4/17/19 | 519265 |
| 4/18/19 | 263818 |
| 4/23/19 | 644504 |
| 4/24/19 | 236218 |
| 4/25/19 | 798819 |
| 4/26/19 | 534158 |
| 4/29/19 | 430617 |
| 4/30/19 | 695608 |
| 5/2/19 | 817580 |
| 5/3/19 | 599690 |
| 5/6/19 | 378081 |
| 5/7/19 | 331597 |
| 5/8/19 | 430856 |
| 5/9/19 | 533729 |
| 5/10/19 | 556577 |
| 5/13/19 | 1207786 |
| 5/14/19 | 739017 |
| 5/15/19 | 373293 |
| 5/16/19 | 304594 |
| 5/17/19 | 289199 |
| 5/20/19 | 602108 |
| 5/21/19 | 722984 |
| 5/22/19 | 574602 |
| 5/23/19 | 437074 |
| 5/24/19 | 1773692 |
| 5/27/19 | 413206 |
| 5/28/19 | 429223 |
| 5/29/19 | 741856 |
| 5/30/19 | 678126 |
| 5/31/19 | 431326 |
| 6/3/19 | 1138526 |
| 6/4/19 | 1313929 |
| 6/5/19 | 1117251 |
| 6/6/19 | 729236 |
| 6/7/19 | 612773 |
| 6/10/19 | 301719 |
| 6/11/19 | 1551809 |
| 6/12/19 | 594520 |
| 6/13/19 | 406011 |
| 6/14/19 | 398789 |
| 6/17/19 | 685958 |
| 6/18/19 | 1758944 |
| 6/19/19 | 993136 |
| 6/20/19 | 523501 |
| 6/21/19 | 987385 |
| 6/24/19 | 1047505 |
| 6/25/19 | 839686 |
| 6/26/19 | 438057 |
| 6/27/19 | 646997 |
| 6/28/19 | 460097 |
| 7/1/19 | 951111 |
| 7/2/19 | 1287214 |
| 7/3/19 | 507824 |
| 7/4/19 | 407511 |
| 7/5/19 | 696986 |
| 7/8/19 | 660065 |
| 7/9/19 | 421053 |
| 7/10/19 | 301021 |
| 7/11/19 | 701718 |
| 7/12/19 | 525417 |
| 7/15/19 | 713930 |
| 7/16/19 | 560997 |
| 7/17/19 | 893368 |
| 7/18/19 | 752794 |
| 7/19/19 | 557362 |
| 7/22/19 | 393832 |
| 7/23/19 | 257794 |
| 7/24/19 | 225391 |
| 7/25/19 | 404637 |
| 7/26/19 | 411163 |
| 7/29/19 | 529711 |
| 7/30/19 | 738459 |
| 7/31/19 | 1016220 |
| 8/1/19 | 450265 |
| 8/2/19 | 170799 |
| 8/5/19 | 321736 |
| 8/6/19 | 510454 |
| 8/7/19 | 641714 |
| 8/8/19 | 348665 |
| 8/9/19 | 382498 |
| 8/12/19 | 264587 |
| 8/13/19 | 314397 |
| 8/14/19 | 357983 |
| 8/16/19 | 537696 |
| 8/19/19 | 240875 |
| 8/20/19 | 509474 |
| 8/21/19 | 285714 |
| 8/22/19 | 565849 |
| 8/23/19 | 828691 |
| 8/26/19 | 569034 |
| 8/27/19 | 616216 |
| 8/28/19 | 618248 |
| 8/29/19 | 592289 |
| 8/30/19 | 468737 |
| 9/2/19 | 139035 |
| 9/3/19 | 288144 |
| 9/4/19 | 496667 |
| 9/5/19 | 413899 |
| 9/6/19 | 353153 |
| 9/9/19 | 283741 |
| 9/10/19 | 880615 |
| 9/11/19 | 713162 |
| 9/12/19 | 387384 |
| 9/13/19 | 329848 |
| 9/16/19 | 201935 |
| 9/17/19 | 228488 |
| 9/18/19 | 422731 |
| 9/19/19 | 513076 |
| 9/20/19 | 175569 |
| 9/23/19 | 105146 |
| 9/24/19 | 486599 |
| 9/25/19 | 530030 |
| 9/26/19 | 348767 |
| 9/27/19 | 720120 |
| 9/30/19 | 518466 |
| 10/1/19 | 399512 |
| 10/2/19 | 629359 |
| 10/3/19 | 354937 |
| 10/4/19 | 590465 |
| 10/7/19 | 280248 |
| 10/8/19 | 137014 |
| 10/9/19 | 313851 |
| 10/10/19 | 205936 |
| 10/11/19 | 264273 |
| 10/14/19 | 106694 |
| 10/15/19 | 415644 |
| 10/16/19 | 416348 |
| 10/17/19 | 807841 |
| 10/18/19 | 297727 |
| 10/21/19 | 175238 |
| 10/22/19 | 130501 |
| 10/23/19 | 343080 |
| 10/24/19 | 212054 |
| 10/25/19 | 84238 |
| 10/28/19 | 125358 |
| 10/29/19 | 165441 |
| 10/30/19 | 202871 |
| 10/31/19 | 226971 |
| 11/1/19 | 78181 |
| 11/4/19 | 182964 |
| 11/5/19 | 281612 |
| 11/6/19 | 249972 |
| 11/7/19 | 417837 |
| 11/8/19 | 431731 |
| 11/11/19 | 350172 |
| 11/12/19 | 173443 |
| 11/13/19 | 396772 |
| 11/14/19 | 400061 |
| 11/15/19 | 339304 |
| 11/18/19 | 365121 |
| 11/19/19 | 327233 |
| 11/20/19 | 311586 |
| 11/21/19 | 169812 |
| 11/22/19 | 211744 |
| 11/25/19 | 78131 |
| 11/26/19 | 153504 |
| 11/27/19 | 143922 |
| 11/28/19 | 148556 |
| 11/29/19 | 110120 |
| 12/2/19 | 420308 |
| 12/3/19 | 157963 |
| 12/4/19 | 214951 |
| 12/5/19 | 557892 |
| 12/6/19 | 199391 |
| 12/9/19 | 396212 |
| 12/10/19 | 166551 |
| 12/11/19 | 292716 |
| 12/12/19 | 171826 |
| 12/13/19 | 326352 |
| 12/16/19 | 265903 |
| 12/17/19 | 340142 |
| 12/18/19 | 543750 |
| 12/19/19 | 204319 |
| 12/20/19 | 257367 |
| 12/23/19 | 124941 |
| 12/27/19 | 370099 |
| 12/30/19 | 172616 |
| 1/2/20 | 111242 |
| 1/3/20 | 209393 |
| 1/6/20 | 183774 |
| 1/7/20 | 206801 |
| 1/8/20 | 211717 |
| 1/9/20 | 526712 |
| 1/10/20 | 334025 |
| 1/13/20 | 821506 |
| 1/14/20 | 495478 |
| 1/15/20 | 513519 |
| 1/16/20 | 227231 |
| 1/17/20 | 340509 |
| 1/20/20 | 425132 |
| 1/21/20 | 503876 |
| 1/22/20 | 601433 |
| 1/23/20 | 515610 |
| 1/24/20 | 424514 |
| 1/27/20 | 358495 |
| 1/28/20 | 455906 |
| 1/29/20 | 369735 |
| 1/30/20 | 289460 |
| 1/31/20 | 286491 |
| 2/3/20 | 371071 |
| 2/4/20 | 442396 |
| 2/5/20 | 819511 |
| 2/6/20 | 401982 |
| 2/7/20 | 181299 |
| 2/10/20 | 104379 |
| 2/11/20 | 255147 |
| 2/12/20 | 245075 |
| 2/13/20 | 408052 |
| 2/14/20 | 166689 |
| 2/17/20 | 297696 |
| 2/18/20 | 412795 |
| 2/19/20 | 460384 |
| 2/20/20 | 240148 |
| 2/21/20 | 191176 |
| 2/24/20 | 428274 |
| 2/25/20 | 301990 |
| 2/26/20 | 186342 |
| 2/27/20 | 271267 |
| 2/28/20 | 483700 |
| 3/2/20 | 341147 |
| 3/3/20 | 851045 |
| 3/4/20 | 520016 |
| 3/5/20 | 666030 |
| 3/6/20 | 577617 |
| 3/9/20 | 575810 |
| 3/10/20 | 1442436 |
| 3/11/20 | 1159501 |
| 3/12/20 | 1309705 |
| 3/13/20 | 1293427 |
| 3/16/20 | 1288170 |
| 3/17/20 | 1400615 |
| 3/18/20 | 790096 |
| 3/19/20 | 1325848 |
| 3/20/20 | 421450 |
| 3/23/20 | 2522899 |
| 3/24/20 | 481489 |
| 3/25/20 | 669306 |
| 3/26/20 | 537667 |
| 3/27/20 | 478714 |
| 3/30/20 | 500966 |
| 3/31/20 | 568664 |
| 4/1/20 | 225377 |
| 4/2/20 | 832049 |
| 4/3/20 | 79208 |
| 4/6/20 | 131052 |
| 4/7/20 | 539190 |
| 4/8/20 | 372133 |
| 4/9/20 | 354095 |
| 4/14/20 | 333379 |
| 4/15/20 | 296949 |
| 4/16/20 | 963751 |
| 4/17/20 | 195564 |
| 4/20/20 | 528212 |
| 4/21/20 | 172806 |
| 4/22/20 | 273623 |
| 4/23/20 | 383927 |
| 4/24/20 | 465745 |
| 4/27/20 | 368788 |
| 4/28/20 | 312618 |
| 4/29/20 | 191613 |
| 4/30/20 | 332343 |
| 5/4/20 | 371738 |
| 5/5/20 | 334559 |
| 5/6/20 | 1055827 |
| 5/7/20 | 749338 |
| 5/8/20 | 296895 |
| 5/11/20 | 461879 |
| 5/12/20 | 1003689 |
| 5/13/20 | 194980 |
| 5/14/20 | 311268 |
| 5/15/20 | 262256 |
| 5/18/20 | 168125 |
| 5/19/20 | 1191128 |
| 5/20/20 | 508175 |
| 5/21/20 | 385394 |
| 5/22/20 | 304979 |
| 5/25/20 | 403700 |
| 5/26/20 | 357473 |
| 5/27/20 | 629641 |
| 5/28/20 | 199523 |
| 5/29/20 | 513125 |
| 6/1/20 | 181836 |
| 6/2/20 | 296798 |
| 6/3/20 | 532420 |
| 6/4/20 | 700463 |
| 6/5/20 | 559228 |
| 6/8/20 | 819696 |
| 6/9/20 | 601665 |
| 6/10/20 | 773870 |
| 6/11/20 | 803232 |
| 6/12/20 | 234262 |
| 6/15/20 | 693714 |
| 6/16/20 | 482595 |
| 6/17/20 | 160514 |
| 6/18/20 | 175122 |
| 6/19/20 | 353247 |
| 6/22/20 | 138608 |
| 6/23/20 | 141290 |
| 6/24/20 | 262905 |
| 6/25/20 | 243343 |
| 6/26/20 | 444941 |
| 6/29/20 | 495470 |
| 6/30/20 | 751322 |
| 7/1/20 | 159311 |
| 7/2/20 | 168080 |
| 7/3/20 | 207327 |
| 7/6/20 | 238470 |
| 7/7/20 | 214876 |
| 7/8/20 | 582590 |
| 7/9/20 | 352281 |
| 7/10/20 | 259817 |
| 7/13/20 | 183837 |
| 7/14/20 | 187518 |
| 7/15/20 | 430471 |
| 7/16/20 | 304061 |
| 7/17/20 | 385390 |
| 7/20/20 | 211799 |
| 7/21/20 | 930976 |
| 7/22/20 | 725380 |
| 7/23/20 | 1182369 |
| 7/24/20 | 274115 |
| 7/27/20 | 201252 |
| 7/28/20 | 837349 |
| 7/29/20 | 692185 |
| 7/30/20 | 403415 |
| 7/31/20 | 902084 |
| 8/3/20 | 571980 |
| 8/4/20 | 784044 |
| 8/5/20 | 496591 |
| 8/6/20 | 418765 |
| 8/7/20 | 1164168 |
| 8/10/20 | 395849 |
| 8/11/20 | 1280381 |
| 8/12/20 | 355343 |
| 8/13/20 | 703439 |
| 8/14/20 | 300296 |
| 8/17/20 | 91765 |
| 8/18/20 | 271607 |
| 8/19/20 | 369638 |
| 8/20/20 | 671623 |
| 8/21/20 | 393874 |
| 8/24/20 | 207180 |
| 8/25/20 | 203534 |
| 8/26/20 | 459464 |
| 8/27/20 | 348017 |
| 8/28/20 | 783364 |
| 8/31/20 | 798359 |
| 9/1/20 | 168350 |
| 9/2/20 | 646771 |
| 9/3/20 | 617539 |
| 9/4/20 | 757068 |
| 9/7/20 | 333265 |
| 9/8/20 | 458522 |
| 9/9/20 | 493824 |
| 9/10/20 | 272495 |
| 9/11/20 | 226779 |
| 9/14/20 | 551364 |
| 9/15/20 | 346082 |
| 9/16/20 | 411918 |
| 9/17/20 | 218298 |
| 9/18/20 | 397454 |
| 9/21/20 | 544543 |
| 9/22/20 | 387824 |
| 9/23/20 | 408494 |
| 9/24/20 | 580431 |
| 9/25/20 | 254261 |
| 9/28/20 | 437129 |
| 9/29/20 | 230817 |
| 9/30/20 | 253231 |
| 10/1/20 | 499926 |
| 10/2/20 | 370852 |
| 10/5/20 | 367723 |
| 10/6/20 | 392564 |
| 10/7/20 | 458444 |
| 10/8/20 | 212673 |
| 10/9/20 | 328344 |
| 10/12/20 | 941836 |
| 10/13/20 | 800150 |
| 10/14/20 | 564498 |
| 10/15/20 | 939934 |
| 10/16/20 | 666394 |
| 10/19/20 | 310556 |
| 10/20/20 | 1109991 |
| 10/21/20 | 651660 |
| 10/22/20 | 243617 |
| 10/23/20 | 189562 |
| 10/26/20 | 493598 |
| 10/27/20 | 670843 |
| 10/28/20 | 868144 |
| 10/29/20 | 698607 |
| 10/30/20 | 283069 |
| 11/2/20 | 333305 |
| 11/3/20 | 516220 |
| 11/4/20 | 957440 |
| 11/5/20 | 724254 |
| 11/6/20 | 167307 |
| 11/9/20 | 1348285 |
| 11/10/20 | 416533 |
| 11/11/20 | 1131083 |
| 11/12/20 | 1732160 |
| 11/13/20 | 679150 |
| 11/16/20 | 1749664 |
| 11/17/20 | 981271 |
| 11/18/20 | 670115 |
| 11/19/20 | 694036 |
| 11/20/20 | 243260 |
| 11/23/20 | 386740 |
| 11/24/20 | 343560 |
| 11/25/20 | 749117 |
| 11/26/20 | 295181 |
| 11/27/20 | 1632632 |
| 11/30/20 | 579814 |
| 12/1/20 | 634899 |
| 12/2/20 | 544311 |
| 12/3/20 | 586476 |
| 12/4/20 | 355008 |
| 12/7/20 | 498850 |
| 12/8/20 | 273108 |
| 12/9/20 | 570465 |
| 12/10/20 | 349314 |
| 12/11/20 | 485226 |
| 12/14/20 | 1021992 |
| 12/15/20 | 385875 |
| 12/16/20 | 317224 |
| 12/17/20 | 976602 |
| 12/18/20 | 637412 |
| 12/21/20 | 304767 |
| 12/22/20 | 169946 |
| 12/23/20 | 143644 |
| 12/28/20 | 107845 |
| 12/29/20 | 180070 |
| 12/30/20 | 95869 |
| 1/4/21 | 56094 |
| 1/5/21 | 8878 |
| 1/8/21 | 54 |
| 1/18/21 | 136 |
| 1/19/21 | 15134 |
| 1/20/21 | 1 |
| 1/29/21 | 7001 |
| 2/15/21 | 551 |
| 2/16/21 | 465 |
| 2/24/21 | 345 |
| 3/1/21 | 8 |
| 3/5/21 | 27 |
| 3/18/21 | 1368 |
| 4/8/21 | 6909 |
| 6/7/21 | 31811 |
| 6/22/21 | 1254 |
| 6/23/21 | 542 |
| 6/24/21 | 1492 |
| 6/28/21 | 112 |
| 6/29/21 | 377 |
| 6/30/21 | 1242 |
| 7/7/21 | 1478 |
| 9/9/21 | 2380 |
| 9/10/21 | 1304 |
| 9/16/21 | 14 |
| 9/29/21 | 1350 |
| 10/8/21 | 1353 |
| 10/28/21 | 13753 |
| 11/1/21 | 2934 |
| 11/9/21 | 1 |
| 11/24/21 | 27 |
| 11/26/21 | 23 |
| 12/10/21 | 354 |
| 12/14/21 | 1418 |
| 12/23/21 | 212 |
| 12/29/21 | 57 |
| 1/13/22 | 2729 |
| 1/14/22 | 12947 |
| 1/18/22 | 74 |
| 1/19/22 | 465 |
| 2/4/22 | 194 |
| 2/21/22 | 428 |
| 2/22/22 | 926 |
| 2/23/22 | 507 |
| 2/24/22 | 1227 |
| 2/25/22 | 2569 |
| 3/2/22 | 7000 |
| 3/3/22 | 1847 |
| 3/4/22 | 11 |
| 3/7/22 | 3476 |
| 3/8/22 | 1161 |
| 3/10/22 | 1918 |
| 3/11/22 | 7597 |
| 3/14/22 | 192 |
| 3/15/22 | 752 |
| 3/18/22 | 183 |
| 3/23/22 | 7753 |
| 3/31/22 | 2392 |
| 4/1/22 | 216 |
| 4/5/22 | 803 |
| 4/6/22 | 423 |
| 4/7/22 | 1508 |
| 4/8/22 | 899 |
| 4/11/22 | 1191 |
| 4/12/22 | 19899 |
| 4/13/22 | 1316 |
| 4/14/22 | 2727 |
| 4/19/22 | 1370 |
| 4/20/22 | 1028 |
| 4/21/22 | 23 |
| 4/22/22 | 2004 |
| 4/25/22 | 152 |
| 5/4/22 | 430 |
| 5/10/22 | 250 |
| 5/17/22 | 205 |
| 5/30/22 | 601 |
| 5/31/22 | 24 |
| 6/1/22 | 14922 |
| 6/10/22 | 9327 |
| 6/22/22 | 900 |
| 6/23/22 | 968 |
| 7/15/22 | 9 |
| 8/2/22 | 0 |
| 8/11/22 | 314 |
| 9/8/22 | 1088 |
| 9/9/22 | 88 |
| 9/23/22 | 153 |
| 9/26/22 | 35 |
| 9/29/22 | 331 |
| 10/11/22 | 32 |
| 10/12/22 | 24 |
| 10/19/22 | 505 |
| 10/20/22 | 4475 |
| 10/28/22 | 9229 |
| 11/17/22 | 1105 |
| 11/18/22 | 71 |
| 11/22/22 | 185 |
| 12/1/22 | 1564 |
| 12/9/22 | 433 |
| 12/22/22 | 26 |
| 1/4/23 | 134 |
| 1/5/23 | 398 |
| 2/7/23 | 1874 |
| 2/13/23 | 48 |
| 2/20/23 | 179 |
| 2/21/23 | 44 |
| 2/27/23 | 1 |
| 3/1/23 | 199 |
| 3/2/23 | 227 |
| 3/7/23 | 473 |
| 3/27/23 | 176 |
| 4/4/23 | 61 |
| 4/25/23 | 4 |
| 5/10/23 | 1452 |
| 5/11/23 | 1464 |
| 5/12/23 | 3097 |
| 5/30/23 | 58 |
| 6/5/23 | 34 |
| 6/6/23 | 62 |
| 6/8/23 | 22 |
| 6/13/23 | 39 |
| 6/14/23 | 15 |
| 6/15/23 | 1 |
| 6/21/23 | 65 |
| 6/22/23 | 101 |
| 6/29/23 | 10 |
| 7/12/23 | 1 |